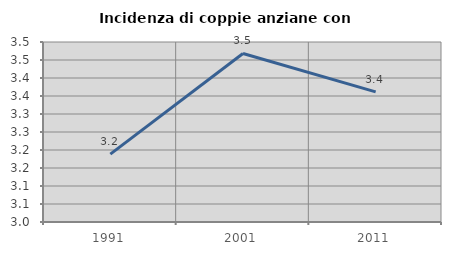
| Category | Incidenza di coppie anziane con figli |
|---|---|
| 1991.0 | 3.188 |
| 2001.0 | 3.468 |
| 2011.0 | 3.361 |